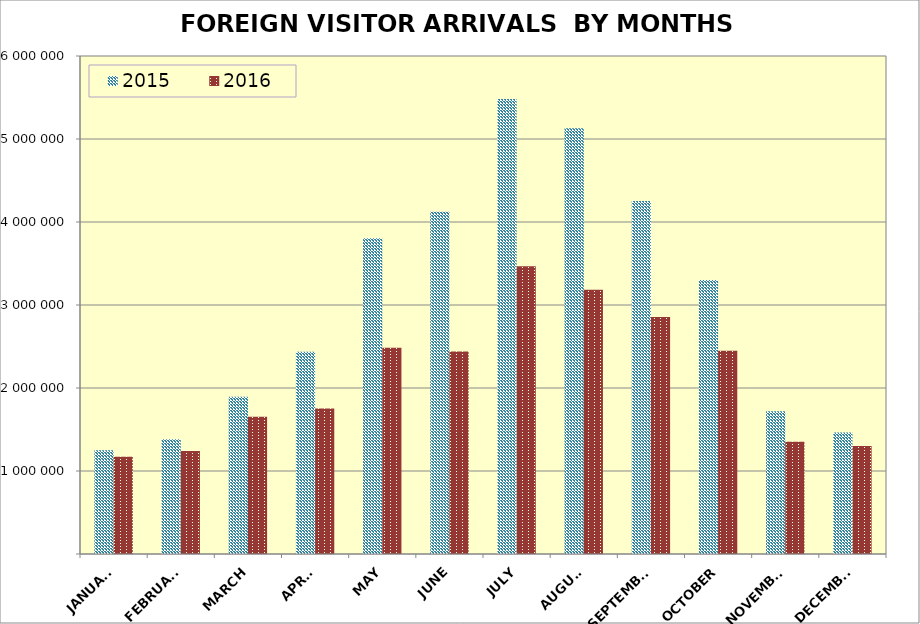
| Category | 2015 | 2016 |
|---|---|---|
| JANUARY | 1250941 | 1170333 |
| FEBRUARY | 1383343 | 1240633 |
| MARCH | 1895940 | 1652511 |
| APRIL | 2437263 | 1753045 |
| MAY | 3804158 | 2485411 |
| JUNE | 4123109 | 2438293 |
| JULY | 5480502 | 3468202 |
| AUGUST | 5130967 | 3183003 |
| SEPTEMBER | 4251870 | 2855397 |
| OCTOBER | 3301194 | 2449948 |
| NOVEMBER | 1720554 | 1353280 |
| DECEMBER | 1464791 | 1302157 |